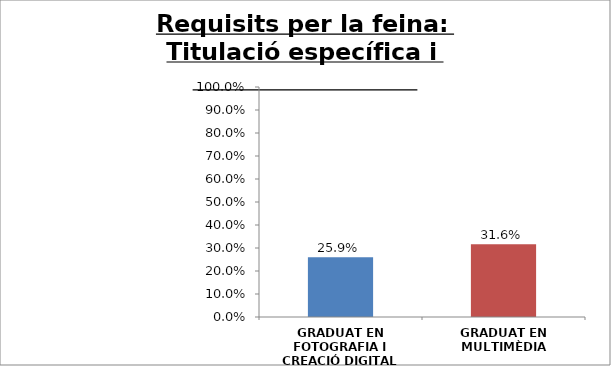
| Category | Series 0 |
|---|---|
| GRADUAT EN FOTOGRAFIA I CREACIÓ DIGITAL | 0.259 |
| GRADUAT EN MULTIMÈDIA | 0.316 |